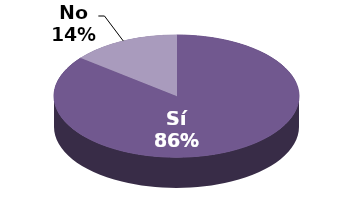
| Category | Series 1 |
|---|---|
| Sí | 24 |
| No | 4 |